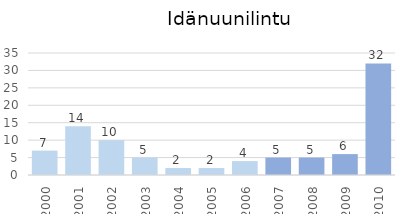
| Category | Series 0 |
|---|---|
| 2000.0 | 7 |
| 2001.0 | 14 |
| 2002.0 | 10 |
| 2003.0 | 5 |
| 2004.0 | 2 |
| 2005.0 | 2 |
| 2006.0 | 4 |
| 2007.0 | 5 |
| 2008.0 | 5 |
| 2009.0 | 6 |
| 2010.0 | 32 |